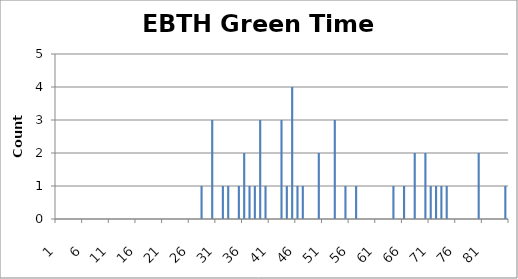
| Category | EBTH Green Time Distribution |
|---|---|
| 0 | 0 |
| 1 | 0 |
| 2 | 0 |
| 3 | 0 |
| 4 | 0 |
| 5 | 0 |
| 6 | 0 |
| 7 | 0 |
| 8 | 0 |
| 9 | 0 |
| 10 | 0 |
| 11 | 0 |
| 12 | 0 |
| 13 | 0 |
| 14 | 0 |
| 15 | 0 |
| 16 | 0 |
| 17 | 0 |
| 18 | 0 |
| 19 | 0 |
| 20 | 0 |
| 21 | 0 |
| 22 | 0 |
| 23 | 0 |
| 24 | 0 |
| 25 | 0 |
| 26 | 0 |
| 27 | 1 |
| 28 | 0 |
| 29 | 3 |
| 30 | 0 |
| 31 | 1 |
| 32 | 1 |
| 33 | 0 |
| 34 | 1 |
| 35 | 2 |
| 36 | 1 |
| 37 | 1 |
| 38 | 3 |
| 39 | 1 |
| 40 | 0 |
| 41 | 0 |
| 42 | 3 |
| 43 | 1 |
| 44 | 4 |
| 45 | 1 |
| 46 | 1 |
| 47 | 0 |
| 48 | 0 |
| 49 | 2 |
| 50 | 0 |
| 51 | 0 |
| 52 | 3 |
| 53 | 0 |
| 54 | 1 |
| 55 | 0 |
| 56 | 1 |
| 57 | 0 |
| 58 | 0 |
| 59 | 0 |
| 60 | 0 |
| 61 | 0 |
| 62 | 0 |
| 63 | 1 |
| 64 | 0 |
| 65 | 1 |
| 66 | 0 |
| 67 | 2 |
| 68 | 0 |
| 69 | 2 |
| 70 | 1 |
| 71 | 1 |
| 72 | 1 |
| 73 | 1 |
| 74 | 0 |
| 75 | 0 |
| 76 | 0 |
| 77 | 0 |
| 78 | 0 |
| 79 | 2 |
| 80 | 0 |
| 81 | 0 |
| 82 | 0 |
| 83 | 0 |
| 84 | 1 |